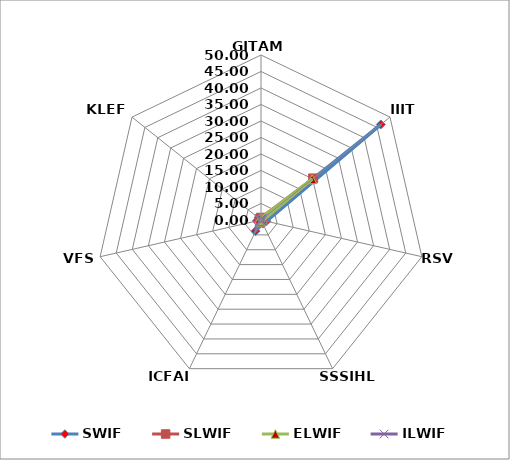
| Category | SWIF | SLWIF | ELWIF | ILWIF |
|---|---|---|---|---|
| GITAM | 0.001 | 0.688 | 0.655 | 0 |
| IIIT | 46.419 | 20.205 | 19.821 | 0.76 |
| RSV | 1.684 | 0.447 | 0.578 | 0.439 |
| SSSIHL | 1.212 | 0.441 | 0.432 | 0.003 |
| ICFAI  | 3.712 | 0.497 | 0.472 | 0.342 |
| VFS | 1.282 | 0.031 | 0.031 | 0.044 |
| KLEF | 0.988 | 0.492 | 0.486 | 0.172 |